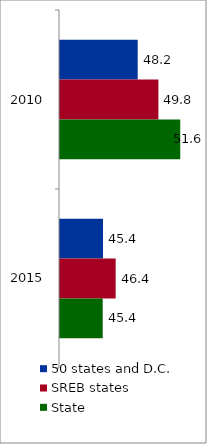
| Category | 50 states and D.C. | SREB states | State |
|---|---|---|---|
| 2010.0 | 48.194 | 49.843 | 51.584 |
| 2015.0 | 45.427 | 46.436 | 45.405 |